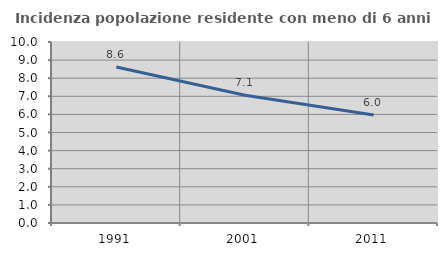
| Category | Incidenza popolazione residente con meno di 6 anni |
|---|---|
| 1991.0 | 8.615 |
| 2001.0 | 7.06 |
| 2011.0 | 5.971 |